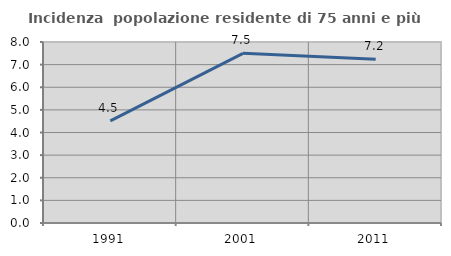
| Category | Incidenza  popolazione residente di 75 anni e più |
|---|---|
| 1991.0 | 4.515 |
| 2001.0 | 7.501 |
| 2011.0 | 7.239 |